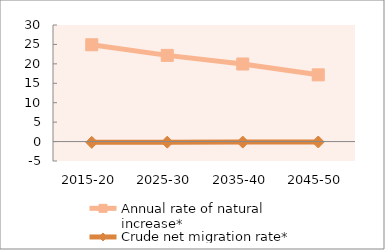
| Category | Annual rate of natural increase* | Crude net migration rate* |
|---|---|---|
| 2015-20 | 24.914 | -0.201 |
| 2025-30 | 22.181 | -0.159 |
| 2035-40 | 19.964 | -0.129 |
| 2045-50 | 17.176 | -0.107 |